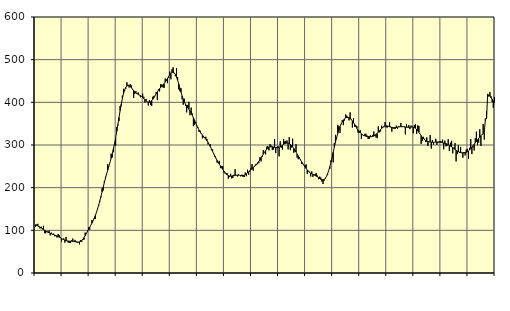
| Category | Piggar | Series 1 |
|---|---|---|
| nan | 108.3 | 113.06 |
| 87.0 | 113.7 | 111.54 |
| 87.0 | 115.3 | 110.34 |
| 87.0 | 107.4 | 108.8 |
| 87.0 | 104.3 | 107.2 |
| 87.0 | 108.4 | 105.52 |
| 87.0 | 102.5 | 103.75 |
| 87.0 | 110.5 | 101.98 |
| 87.0 | 93.4 | 100.26 |
| 87.0 | 93 | 98.62 |
| 87.0 | 97.9 | 97.03 |
| 87.0 | 97 | 95.54 |
| nan | 99.2 | 94.23 |
| 88.0 | 88.2 | 93.08 |
| 88.0 | 94.6 | 92.02 |
| 88.0 | 89.9 | 91.02 |
| 88.0 | 92.2 | 90.02 |
| 88.0 | 86 | 88.94 |
| 88.0 | 86.5 | 87.77 |
| 88.0 | 83.2 | 86.53 |
| 88.0 | 91.4 | 85.25 |
| 88.0 | 88.8 | 83.96 |
| 88.0 | 83.5 | 82.59 |
| 88.0 | 73.5 | 81.13 |
| nan | 79.2 | 79.62 |
| 89.0 | 81.1 | 78.17 |
| 89.0 | 71.4 | 76.91 |
| 89.0 | 84.3 | 75.9 |
| 89.0 | 75.6 | 75.21 |
| 89.0 | 71.2 | 74.82 |
| 89.0 | 70.4 | 74.65 |
| 89.0 | 70.9 | 74.59 |
| 89.0 | 76.4 | 74.52 |
| 89.0 | 80.7 | 74.28 |
| 89.0 | 74.2 | 73.88 |
| 89.0 | 77.6 | 73.39 |
| nan | 74 | 72.9 |
| 90.0 | 71.2 | 72.57 |
| 90.0 | 71.9 | 72.59 |
| 90.0 | 67.2 | 73.14 |
| 90.0 | 77.4 | 74.34 |
| 90.0 | 72.7 | 76.38 |
| 90.0 | 77.3 | 79.35 |
| 90.0 | 78.1 | 83.14 |
| 90.0 | 94.6 | 87.52 |
| 90.0 | 91.8 | 92.26 |
| 90.0 | 99.1 | 97.17 |
| 90.0 | 106.8 | 102.11 |
| nan | 101.5 | 107 |
| 91.0 | 112.2 | 111.91 |
| 91.0 | 124 | 116.96 |
| 91.0 | 123 | 122.32 |
| 91.0 | 126.5 | 128.18 |
| 91.0 | 126.7 | 134.7 |
| 91.0 | 142.6 | 142.04 |
| 91.0 | 151.2 | 150.28 |
| 91.0 | 157.4 | 159.33 |
| 91.0 | 167.5 | 169.09 |
| 91.0 | 177.4 | 179.45 |
| 91.0 | 198.6 | 190.19 |
| nan | 193.4 | 201.09 |
| 92.0 | 215.3 | 211.82 |
| 92.0 | 225.4 | 222.11 |
| 92.0 | 230.7 | 231.89 |
| 92.0 | 254.9 | 241.18 |
| 92.0 | 249.5 | 250.21 |
| 92.0 | 259 | 259.24 |
| 92.0 | 279.6 | 268.58 |
| 92.0 | 270.9 | 278.68 |
| 92.0 | 283.1 | 289.94 |
| 92.0 | 301.4 | 302.57 |
| 92.0 | 298.2 | 316.59 |
| nan | 341.9 | 331.86 |
| 93.0 | 345.3 | 348.02 |
| 93.0 | 356.2 | 364.45 |
| 93.0 | 391.4 | 380.51 |
| 93.0 | 391.7 | 395.61 |
| 93.0 | 415.8 | 409.1 |
| 93.0 | 431.7 | 420.42 |
| 93.0 | 426.2 | 429.14 |
| 93.0 | 432 | 435.12 |
| 93.0 | 447.1 | 438.54 |
| 93.0 | 441.2 | 439.72 |
| 93.0 | 434.6 | 439.08 |
| nan | 442.6 | 437.09 |
| 94.0 | 439.7 | 434.2 |
| 94.0 | 430.1 | 430.99 |
| 94.0 | 410.4 | 427.84 |
| 94.0 | 419.5 | 424.96 |
| 94.0 | 426 | 422.55 |
| 94.0 | 421.7 | 420.52 |
| 94.0 | 423 | 418.8 |
| 94.0 | 416.4 | 417.3 |
| 94.0 | 411.8 | 415.71 |
| 94.0 | 414.2 | 413.77 |
| 94.0 | 420.4 | 411.43 |
| nan | 413 | 408.73 |
| 95.0 | 399.6 | 405.88 |
| 95.0 | 408 | 403.24 |
| 95.0 | 400.8 | 401.27 |
| 95.0 | 392.6 | 400.24 |
| 95.0 | 405 | 400.26 |
| 95.0 | 393.7 | 401.43 |
| 95.0 | 391.7 | 403.79 |
| 95.0 | 413.1 | 407.13 |
| 95.0 | 415.1 | 411.19 |
| 95.0 | 416.2 | 415.66 |
| 95.0 | 424.1 | 420.19 |
| nan | 405.1 | 424.45 |
| 96.0 | 430.5 | 428.37 |
| 96.0 | 425.5 | 431.88 |
| 96.0 | 442.6 | 434.95 |
| 96.0 | 441.7 | 437.81 |
| 96.0 | 435.1 | 440.74 |
| 96.0 | 433.6 | 443.87 |
| 96.0 | 455.7 | 447.37 |
| 96.0 | 453.3 | 451.34 |
| 96.0 | 444.9 | 455.68 |
| 96.0 | 457.1 | 460.13 |
| 96.0 | 472 | 464.3 |
| nan | 454 | 467.78 |
| 97.0 | 477.2 | 470 |
| 97.0 | 482.2 | 470.5 |
| 97.0 | 467.5 | 469.01 |
| 97.0 | 461.4 | 465.32 |
| 97.0 | 479.9 | 459.46 |
| 97.0 | 459.2 | 451.83 |
| 97.0 | 430.4 | 442.89 |
| 97.0 | 426.1 | 433.26 |
| 97.0 | 432.7 | 423.72 |
| 97.0 | 407 | 414.96 |
| 97.0 | 394.4 | 407.33 |
| nan | 408.3 | 400.97 |
| 98.0 | 391.3 | 395.79 |
| 98.0 | 376.5 | 391.44 |
| 98.0 | 393.9 | 387.56 |
| 98.0 | 401.2 | 383.75 |
| 98.0 | 369.8 | 379.63 |
| 98.0 | 387.6 | 374.97 |
| 98.0 | 373.8 | 369.76 |
| 98.0 | 344.1 | 364.04 |
| 98.0 | 347.4 | 357.9 |
| 98.0 | 353.7 | 351.62 |
| 98.0 | 346 | 345.57 |
| nan | 341.4 | 339.95 |
| 99.0 | 330.8 | 334.91 |
| 99.0 | 333.5 | 330.53 |
| 99.0 | 328 | 326.75 |
| 99.0 | 315.6 | 323.32 |
| 99.0 | 317.8 | 320.09 |
| 99.0 | 318.4 | 316.93 |
| 99.0 | 319.3 | 313.6 |
| 99.0 | 314.2 | 309.94 |
| 99.0 | 301.4 | 305.9 |
| 99.0 | 301.7 | 301.4 |
| 99.0 | 301.9 | 296.36 |
| nan | 287.7 | 290.94 |
| 0.0 | 289.3 | 285.31 |
| 0.0 | 278.5 | 279.68 |
| 0.0 | 271.9 | 274.18 |
| 0.0 | 268.1 | 268.96 |
| 0.0 | 258.8 | 264.11 |
| 0.0 | 257.5 | 259.51 |
| 0.0 | 262.8 | 255.12 |
| 0.0 | 245.8 | 250.92 |
| 0.0 | 250.5 | 246.89 |
| 0.0 | 250.6 | 242.96 |
| 0.0 | 235.6 | 239.15 |
| nan | 233.3 | 235.62 |
| 1.0 | 231.2 | 232.54 |
| 1.0 | 233.8 | 230.06 |
| 1.0 | 221 | 228.31 |
| 1.0 | 225.4 | 227.32 |
| 1.0 | 232.5 | 227.03 |
| 1.0 | 221.7 | 227.32 |
| 1.0 | 222.7 | 227.92 |
| 1.0 | 230 | 228.6 |
| 1.0 | 243.4 | 229.15 |
| 1.0 | 229 | 229.45 |
| 1.0 | 226.2 | 229.47 |
| nan | 231 | 229.27 |
| 2.0 | 228.7 | 228.88 |
| 2.0 | 226.5 | 228.49 |
| 2.0 | 230.6 | 228.32 |
| 2.0 | 225.4 | 228.55 |
| 2.0 | 224.8 | 229.28 |
| 2.0 | 235.4 | 230.58 |
| 2.0 | 226.9 | 232.45 |
| 2.0 | 242.1 | 234.7 |
| 2.0 | 230.4 | 237.16 |
| 2.0 | 236.7 | 239.7 |
| 2.0 | 246.7 | 242.24 |
| nan | 255.2 | 244.72 |
| 3.0 | 239.9 | 247.17 |
| 3.0 | 250.9 | 249.63 |
| 3.0 | 254.4 | 252.19 |
| 3.0 | 252.9 | 254.97 |
| 3.0 | 255 | 258.08 |
| 3.0 | 257.7 | 261.53 |
| 3.0 | 271.4 | 265.36 |
| 3.0 | 261.5 | 269.58 |
| 3.0 | 272.5 | 273.96 |
| 3.0 | 288.2 | 278.4 |
| 3.0 | 282.1 | 282.66 |
| nan | 278 | 286.48 |
| 4.0 | 295.9 | 289.81 |
| 4.0 | 297.3 | 292.5 |
| 4.0 | 287.3 | 294.4 |
| 4.0 | 302.2 | 295.57 |
| 4.0 | 298.4 | 296 |
| 4.0 | 288.1 | 295.84 |
| 4.0 | 289.4 | 295.23 |
| 4.0 | 313.7 | 294.43 |
| 4.0 | 281.2 | 293.79 |
| 4.0 | 295.6 | 293.46 |
| 4.0 | 297.4 | 293.66 |
| nan | 273.4 | 294.53 |
| 5.0 | 308.6 | 295.91 |
| 5.0 | 293.6 | 297.66 |
| 5.0 | 289.4 | 299.62 |
| 5.0 | 313.8 | 301.49 |
| 5.0 | 308.4 | 303.03 |
| 5.0 | 309.7 | 304.15 |
| 5.0 | 310.5 | 304.67 |
| 5.0 | 289.7 | 304.42 |
| 5.0 | 318.7 | 303.33 |
| 5.0 | 287.8 | 301.51 |
| 5.0 | 294.3 | 298.96 |
| nan | 314.7 | 295.78 |
| 6.0 | 281.8 | 292.05 |
| 6.0 | 284.6 | 287.87 |
| 6.0 | 301.8 | 283.45 |
| 6.0 | 270.4 | 278.87 |
| 6.0 | 266.7 | 274.19 |
| 6.0 | 271 | 269.51 |
| 6.0 | 266.5 | 264.91 |
| 6.0 | 255.4 | 260.5 |
| 6.0 | 257.1 | 256.31 |
| 6.0 | 252.1 | 252.26 |
| 6.0 | 252.5 | 248.45 |
| nan | 254.6 | 244.88 |
| 7.0 | 232.2 | 241.56 |
| 7.0 | 237.4 | 238.64 |
| 7.0 | 237.4 | 236.11 |
| 7.0 | 226.2 | 234.02 |
| 7.0 | 238.1 | 232.43 |
| 7.0 | 225.3 | 231.13 |
| 7.0 | 229.2 | 229.89 |
| 7.0 | 232.5 | 228.56 |
| 7.0 | 234.2 | 227.04 |
| 7.0 | 228.3 | 225.26 |
| 7.0 | 219.8 | 223.25 |
| nan | 226 | 221.18 |
| 8.0 | 223.7 | 219.47 |
| 8.0 | 214.2 | 218.45 |
| 8.0 | 208.5 | 218.3 |
| 8.0 | 216.6 | 219.35 |
| 8.0 | 220.7 | 221.94 |
| 8.0 | 226.7 | 226.2 |
| 8.0 | 229.5 | 232.25 |
| 8.0 | 240 | 239.98 |
| 8.0 | 244.3 | 249.19 |
| 8.0 | 263.9 | 259.66 |
| 8.0 | 272 | 271.07 |
| nan | 259.3 | 282.95 |
| 9.0 | 304.9 | 294.81 |
| 9.0 | 323.8 | 306.29 |
| 9.0 | 314.7 | 317.14 |
| 9.0 | 347.1 | 327 |
| 9.0 | 343.9 | 335.64 |
| 9.0 | 328.5 | 343.06 |
| 9.0 | 348.7 | 349.27 |
| 9.0 | 358.2 | 354.35 |
| 9.0 | 346.5 | 358.34 |
| 9.0 | 357.4 | 361.33 |
| 9.0 | 371.4 | 363.38 |
| nan | 368.8 | 364.58 |
| 10.0 | 363.3 | 364.87 |
| 10.0 | 357.5 | 364.13 |
| 10.0 | 376.4 | 362.43 |
| 10.0 | 361.3 | 359.88 |
| 10.0 | 341 | 356.52 |
| 10.0 | 362.8 | 352.48 |
| 10.0 | 342.8 | 348.02 |
| 10.0 | 346.6 | 343.44 |
| 10.0 | 344.1 | 339.07 |
| 10.0 | 329.3 | 335.1 |
| 10.0 | 328.6 | 331.58 |
| nan | 334.5 | 328.53 |
| 11.0 | 314 | 326 |
| 11.0 | 324.8 | 324 |
| 11.0 | 322 | 322.48 |
| 11.0 | 326 | 321.39 |
| 11.0 | 326.4 | 320.65 |
| 11.0 | 322.2 | 320.15 |
| 11.0 | 314 | 319.77 |
| 11.0 | 314.1 | 319.5 |
| 11.0 | 323.1 | 319.37 |
| 11.0 | 320 | 319.51 |
| 11.0 | 323.6 | 320.01 |
| nan | 331.8 | 320.99 |
| 12.0 | 324.2 | 322.53 |
| 12.0 | 317.6 | 324.69 |
| 12.0 | 316.1 | 327.26 |
| 12.0 | 343.5 | 330.09 |
| 12.0 | 329.8 | 333.08 |
| 12.0 | 331.9 | 336.08 |
| 12.0 | 345.5 | 338.94 |
| 12.0 | 341.2 | 341.45 |
| 12.0 | 341.6 | 343.37 |
| 12.0 | 353.8 | 344.54 |
| 12.0 | 341.4 | 344.97 |
| nan | 341 | 344.71 |
| 13.0 | 343.6 | 343.94 |
| 13.0 | 353 | 342.9 |
| 13.0 | 343.1 | 341.86 |
| 13.0 | 331.4 | 340.98 |
| 13.0 | 339.4 | 340.45 |
| 13.0 | 337.6 | 340.36 |
| 13.0 | 338.2 | 340.63 |
| 13.0 | 345.4 | 341.1 |
| 13.0 | 338 | 341.68 |
| 13.0 | 343.5 | 342.24 |
| 13.0 | 343.5 | 342.64 |
| nan | 351.6 | 342.94 |
| 14.0 | 342.8 | 343.04 |
| 14.0 | 342.6 | 342.86 |
| 14.0 | 343.7 | 342.51 |
| 14.0 | 324.8 | 342.13 |
| 14.0 | 349.3 | 341.76 |
| 14.0 | 342.5 | 341.48 |
| 14.0 | 346.5 | 341.47 |
| 14.0 | 337.2 | 341.73 |
| 14.0 | 345.7 | 342.07 |
| 14.0 | 342.8 | 342.22 |
| 14.0 | 327.3 | 341.91 |
| nan | 346.5 | 340.89 |
| 15.0 | 348.8 | 339.1 |
| 15.0 | 326 | 336.58 |
| 15.0 | 346.1 | 333.36 |
| 15.0 | 344.6 | 329.71 |
| 15.0 | 325.7 | 325.83 |
| 15.0 | 302.5 | 321.9 |
| 15.0 | 309.6 | 318.2 |
| 15.0 | 319.1 | 314.89 |
| 15.0 | 314.7 | 312.17 |
| 15.0 | 306.8 | 310.13 |
| 15.0 | 318 | 308.76 |
| nan | 297.9 | 307.92 |
| 16.0 | 307.9 | 307.39 |
| 16.0 | 323.4 | 307.01 |
| 16.0 | 291.5 | 306.78 |
| 16.0 | 311.7 | 306.55 |
| 16.0 | 301 | 306.43 |
| 16.0 | 306.5 | 306.51 |
| 16.0 | 314.6 | 306.7 |
| 16.0 | 300.4 | 306.89 |
| 16.0 | 305.6 | 306.94 |
| 16.0 | 308.5 | 306.75 |
| 16.0 | 309.5 | 306.39 |
| nan | 308 | 305.89 |
| 17.0 | 312.6 | 305.22 |
| 17.0 | 289.8 | 304.49 |
| 17.0 | 310.4 | 303.77 |
| 17.0 | 296.7 | 303 |
| 17.0 | 298.3 | 302.05 |
| 17.0 | 313.6 | 300.8 |
| 17.0 | 286.1 | 299.25 |
| 17.0 | 305.4 | 297.5 |
| 17.0 | 309.8 | 295.63 |
| 17.0 | 280.4 | 293.68 |
| 17.0 | 293.8 | 291.65 |
| nan | 304.4 | 289.57 |
| 18.0 | 261.6 | 287.62 |
| 18.0 | 278.5 | 285.9 |
| 18.0 | 299.7 | 284.39 |
| 18.0 | 281.5 | 283.14 |
| 18.0 | 295.5 | 282.27 |
| 18.0 | 280.9 | 281.81 |
| 18.0 | 270.1 | 281.67 |
| 18.0 | 283.4 | 281.75 |
| 18.0 | 275.6 | 282.06 |
| 18.0 | 289.1 | 282.8 |
| 18.0 | 291 | 284.06 |
| nan | 267.5 | 285.92 |
| 19.0 | 293.4 | 288.43 |
| 19.0 | 313.7 | 291.45 |
| 19.0 | 278.7 | 294.75 |
| 19.0 | 294.7 | 298.19 |
| 19.0 | 287.2 | 301.63 |
| 19.0 | 315.6 | 305.03 |
| 19.0 | 331.4 | 308.48 |
| 19.0 | 299.6 | 311.93 |
| 19.0 | 305.8 | 315.29 |
| 19.0 | 336.7 | 318.56 |
| 19.0 | 298.1 | 321.73 |
| nan | 323.8 | 324.65 |
| 20.0 | 349 | 327.15 |
| 20.0 | 312.9 | 328.98 |
| 20.0 | 357.5 | 361.65 |
| 20.0 | 378.5 | 361.88 |
| 20.0 | 417.3 | 418.85 |
| 20.0 | 413.7 | 417.11 |
| 20.0 | 424.1 | 414.38 |
| 20.0 | 414.3 | 410.94 |
| 20.0 | 401.1 | 407.18 |
| 20.0 | 387.2 | 403.28 |
| 20.0 | 412.3 | 399.46 |